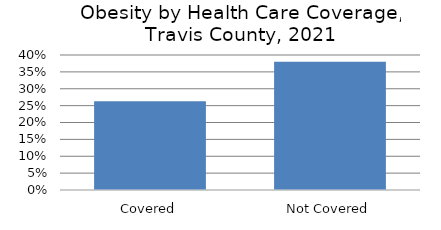
| Category | Series 0 |
|---|---|
| Covered | 0.263 |
| Not Covered | 0.38 |